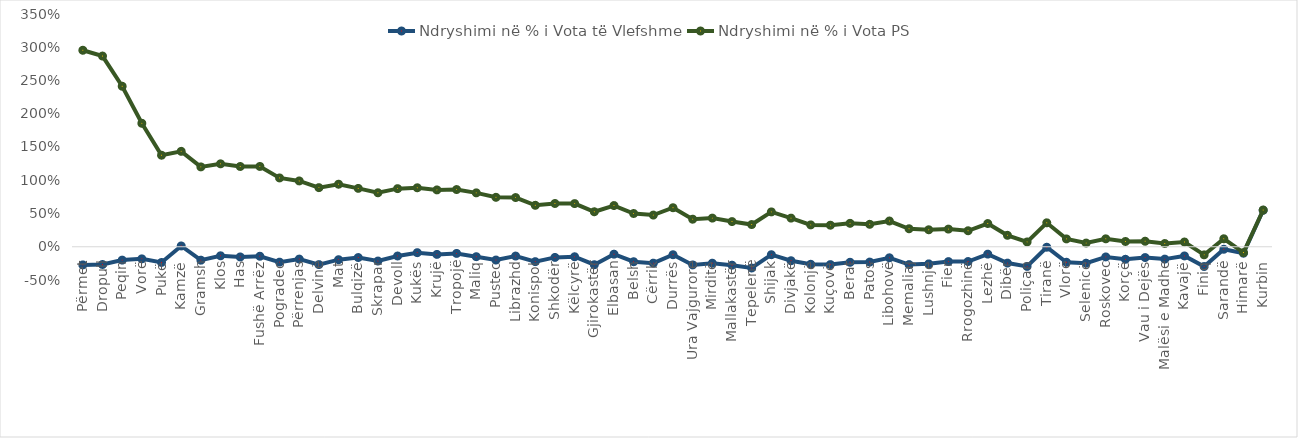
| Category | Ndryshimi në % i Vota të Vlefshme | Ndryshimi në % i Vota PS |
|---|---|---|
| Përmet | -0.273 | 2.955 |
| Dropull | -0.267 | 2.868 |
| Peqin | -0.201 | 2.414 |
| Vorë | -0.182 | 1.856 |
| Pukë | -0.236 | 1.376 |
| Kamzë | 0.012 | 1.435 |
| Gramsh | -0.202 | 1.201 |
| Klos | -0.136 | 1.247 |
| Has | -0.153 | 1.207 |
| Fushë Arrëz | -0.143 | 1.208 |
| Pogradec | -0.231 | 1.035 |
| Përrenjas | -0.185 | 0.99 |
| Delvinë | -0.268 | 0.889 |
| Mat | -0.194 | 0.94 |
| Bulqizë | -0.162 | 0.878 |
| Skrapar | -0.215 | 0.812 |
| Devoll | -0.139 | 0.874 |
| Kukës | -0.089 | 0.887 |
| Krujë | -0.115 | 0.855 |
| Tropojë | -0.1 | 0.86 |
| Maliq | -0.149 | 0.81 |
| Pustec | -0.2 | 0.743 |
| Librazhd | -0.14 | 0.74 |
| Konispol | -0.224 | 0.623 |
| Shkodër | -0.16 | 0.65 |
| Këlcyrë | -0.151 | 0.649 |
| Gjirokastër | -0.27 | 0.526 |
| Elbasan | -0.112 | 0.619 |
| Belsh | -0.225 | 0.5 |
| Cërrik | -0.246 | 0.476 |
| Durrës | -0.12 | 0.587 |
| Ura Vajgurore | -0.273 | 0.414 |
| Mirditë | -0.247 | 0.431 |
| Mallakastër | -0.277 | 0.379 |
| Tepelenë | -0.32 | 0.334 |
| Shijak | -0.119 | 0.524 |
| Divjakë | -0.21 | 0.431 |
| Kolonjë | -0.264 | 0.329 |
| Kuçovë | -0.268 | 0.324 |
| Berat | -0.234 | 0.352 |
| Patos | -0.23 | 0.338 |
| Libohovë | -0.166 | 0.387 |
| Memaliaj | -0.268 | 0.271 |
| Lushnje | -0.257 | 0.255 |
| Fier | -0.223 | 0.265 |
| Rrogozhinë | -0.222 | 0.24 |
| Lezhë | -0.111 | 0.349 |
| Dibër | -0.246 | 0.172 |
| Poliçan | -0.296 | 0.072 |
| Tiranë | -0.007 | 0.36 |
| Vlorë | -0.233 | 0.118 |
| Selenicë | -0.247 | 0.055 |
| Roskovec | -0.153 | 0.119 |
| Korçë | -0.188 | 0.079 |
| Vau i Dejës | -0.162 | 0.083 |
| Malësi e Madhe | -0.186 | 0.048 |
| Kavajë | -0.138 | 0.071 |
| Finiq | -0.297 | -0.122 |
| Sarandë | -0.038 | 0.12 |
| Himarë | -0.098 | -0.088 |
| Kurbin | 0.549 | 0.552 |